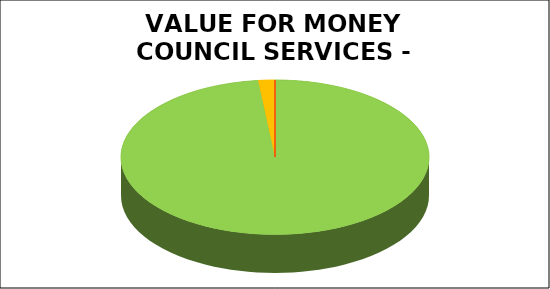
| Category | Series 0 |
|---|---|
| Green | 0.982 |
| Amber | 0.018 |
| Red | 0 |